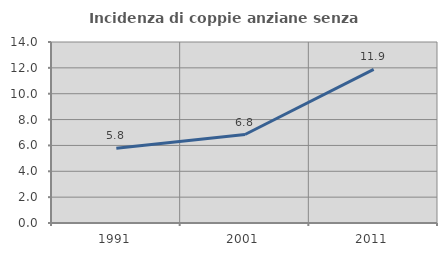
| Category | Incidenza di coppie anziane senza figli  |
|---|---|
| 1991.0 | 5.774 |
| 2001.0 | 6.843 |
| 2011.0 | 11.877 |